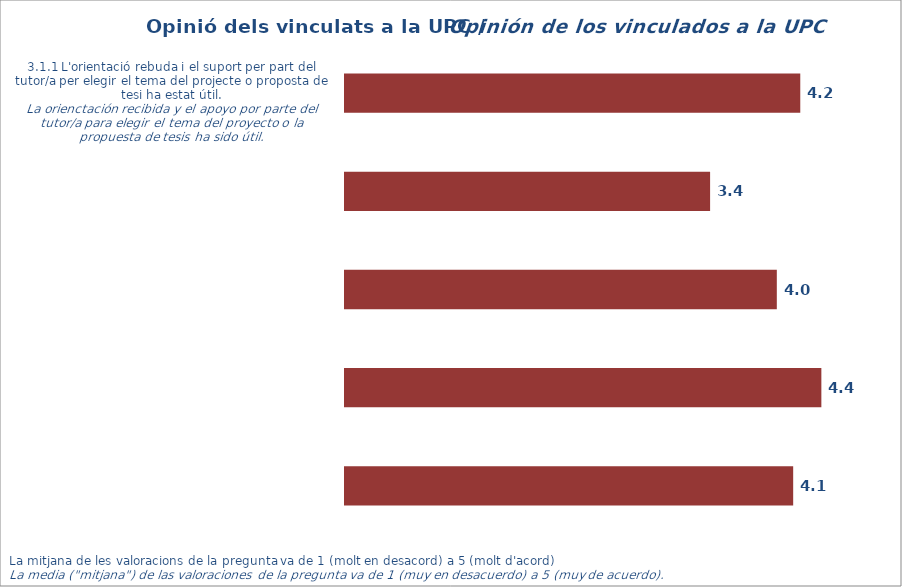
| Category | Mitjana |
|---|---|
| 1.0 | 4.208 |
| 2.0 | 3.374 |
| 3.0 | 3.991 |
| 4.0 | 4.403 |
| 5.0 | 4.142 |